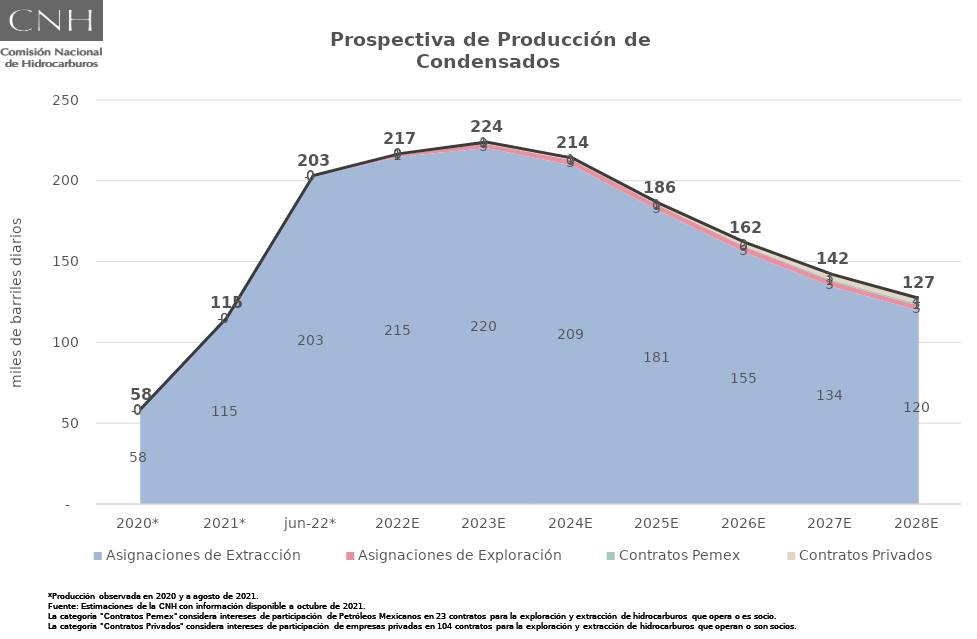
| Category | Total |
|---|---|
| 2020* | 58.421 |
| 2021* | 115.166 |
| jun-22* | 203.259 |
| 2022E | 216.81 |
| 2023E | 223.922 |
| 2024E | 214.023 |
| 2025E | 186.027 |
| 2026E | 161.721 |
| 2027E | 142.105 |
| 2028E | 127.344 |